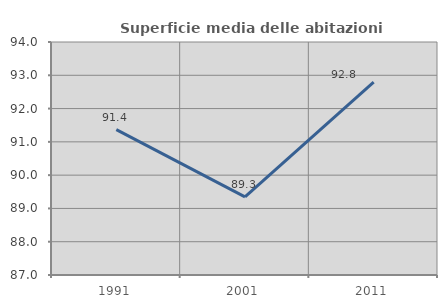
| Category | Superficie media delle abitazioni occupate |
|---|---|
| 1991.0 | 91.367 |
| 2001.0 | 89.346 |
| 2011.0 | 92.796 |